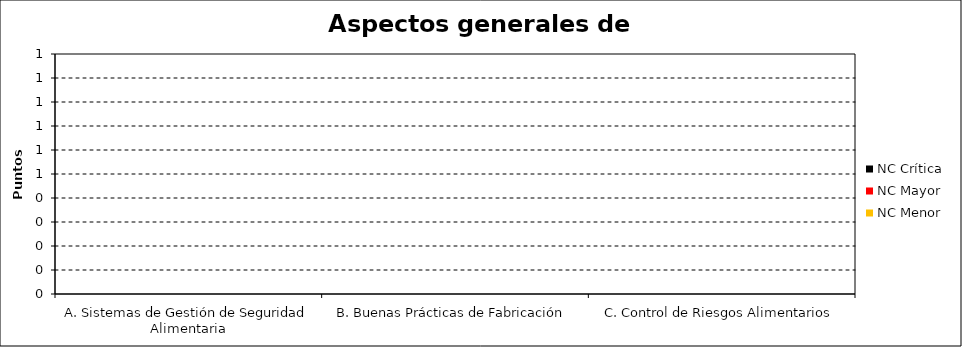
| Category | NC Menor | NC Mayor | NC Crítica |
|---|---|---|---|
| A. Sistemas de Gestión de Seguridad Alimentaria | 0 | 0 | 0 |
| B. Buenas Prácticas de Fabricación | 0 | 0 | 0 |
| C. Control de Riesgos Alimentarios | 0 | 0 | 0 |